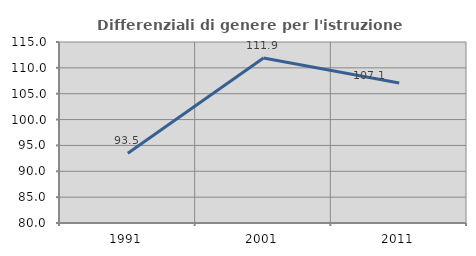
| Category | Differenziali di genere per l'istruzione superiore |
|---|---|
| 1991.0 | 93.483 |
| 2001.0 | 111.897 |
| 2011.0 | 107.08 |